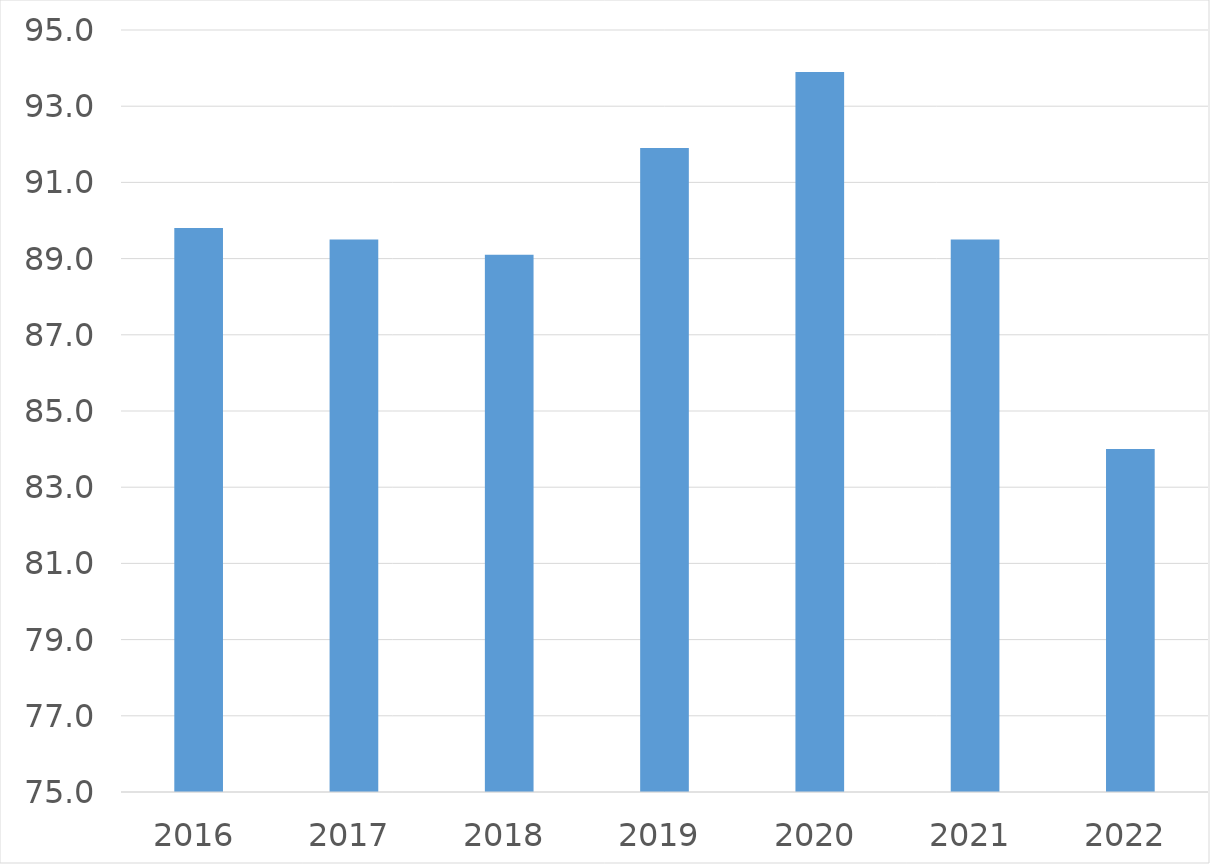
| Category | Series 0 |
|---|---|
| 2016 | 89.8 |
| 2017 | 89.5 |
| 2018 | 89.1 |
| 2019 | 91.9 |
| 2020 | 93.9 |
| 2021 | 89.5 |
| 2022 | 84 |